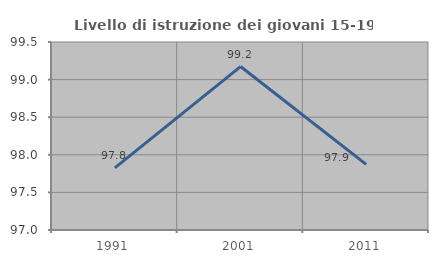
| Category | Livello di istruzione dei giovani 15-19 anni |
|---|---|
| 1991.0 | 97.826 |
| 2001.0 | 99.174 |
| 2011.0 | 97.872 |